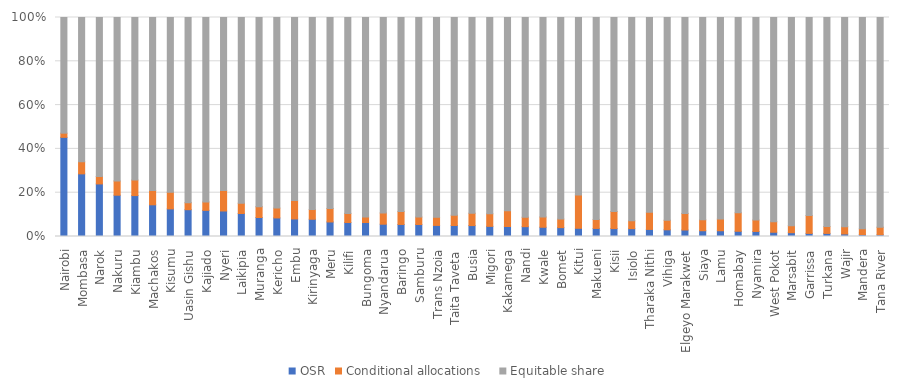
| Category | OSR | Conditional allocations   | Equitable share |
|---|---|---|---|
| Nairobi | 0.453 | 0.019 | 0.528 |
| Mombasa | 0.286 | 0.055 | 0.659 |
| Narok | 0.24 | 0.034 | 0.726 |
| Nakuru | 0.189 | 0.065 | 0.746 |
| Kiambu | 0.187 | 0.071 | 0.742 |
| Machakos | 0.145 | 0.065 | 0.79 |
| Kisumu | 0.126 | 0.076 | 0.798 |
| Uasin Gishu | 0.122 | 0.032 | 0.845 |
| Kajiado | 0.119 | 0.038 | 0.842 |
| Nyeri | 0.116 | 0.094 | 0.79 |
| Laikipia | 0.105 | 0.047 | 0.848 |
| Muranga | 0.087 | 0.05 | 0.864 |
| Kericho | 0.085 | 0.045 | 0.87 |
| Embu | 0.08 | 0.084 | 0.836 |
| Kirinyaga | 0.079 | 0.044 | 0.877 |
| Meru | 0.066 | 0.062 | 0.872 |
| Kilifi | 0.064 | 0.042 | 0.895 |
| Bungoma | 0.064 | 0.025 | 0.911 |
| Nyandarua | 0.056 | 0.052 | 0.892 |
| Baringo | 0.055 | 0.059 | 0.886 |
| Samburu | 0.055 | 0.034 | 0.911 |
| Trans Nzoia | 0.051 | 0.038 | 0.912 |
| Taita Taveta | 0.05 | 0.047 | 0.903 |
| Busia | 0.05 | 0.056 | 0.894 |
| Migori | 0.046 | 0.057 | 0.896 |
| Kakamega | 0.046 | 0.072 | 0.883 |
| Nandi | 0.045 | 0.043 | 0.912 |
| Kwale | 0.042 | 0.047 | 0.911 |
| Bomet | 0.04 | 0.039 | 0.92 |
| Kitui | 0.038 | 0.152 | 0.811 |
| Makueni | 0.037 | 0.041 | 0.922 |
| Kisii | 0.036 | 0.078 | 0.886 |
| Isiolo | 0.036 | 0.036 | 0.929 |
| Tharaka Nithi | 0.032 | 0.078 | 0.889 |
| Vihiga | 0.031 | 0.044 | 0.926 |
| Elgeyo Marakwet | 0.03 | 0.076 | 0.895 |
| Siaya | 0.026 | 0.05 | 0.924 |
| Lamu | 0.026 | 0.053 | 0.92 |
| Homabay | 0.024 | 0.084 | 0.892 |
| Nyamira | 0.023 | 0.052 | 0.925 |
| West Pokot | 0.019 | 0.048 | 0.932 |
| Marsabit | 0.017 | 0.032 | 0.951 |
| Garrissa | 0.014 | 0.081 | 0.905 |
| Turkana | 0.014 | 0.031 | 0.955 |
| Wajir | 0.012 | 0.033 | 0.955 |
| Mandera | 0.009 | 0.026 | 0.965 |
| Tana River | 0.008 | 0.034 | 0.957 |